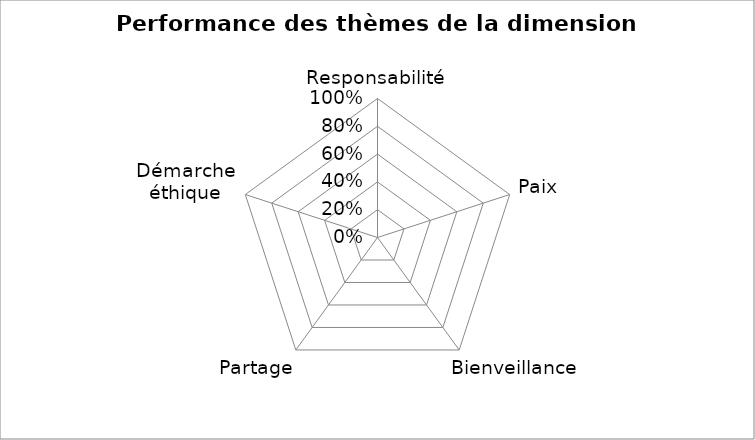
| Category | Series 0 |
|---|---|
| Responsabilité | 0 |
| Paix | 0 |
| Bienveillance | 0 |
| Partage | 0 |
| Démarche éthique | 0 |